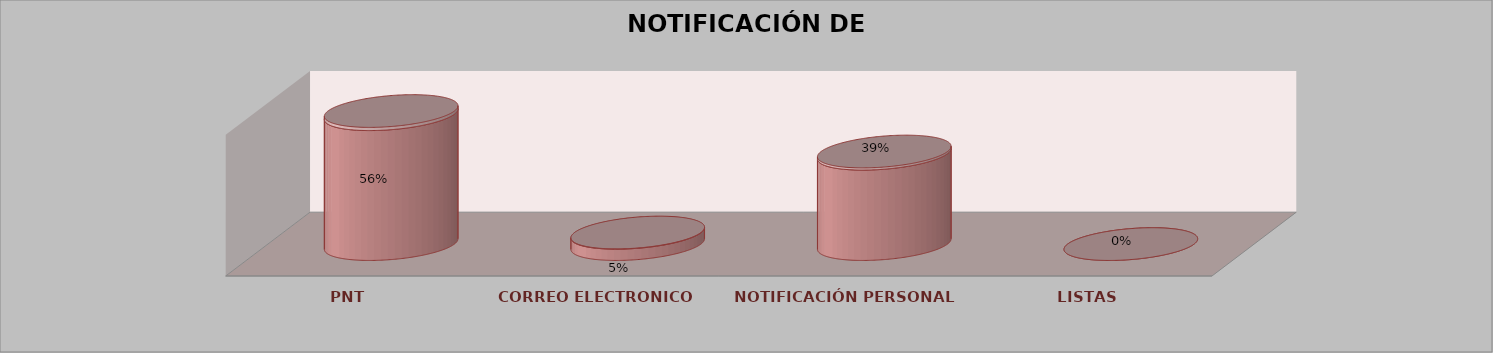
| Category | Series 0 | Series 1 | Series 2 | Series 3 | Series 4 |
|---|---|---|---|---|---|
| PNT |  |  |  | 23 | 0.561 |
| CORREO ELECTRONICO |  |  |  | 2 | 0.049 |
| NOTIFICACIÓN PERSONAL |  |  |  | 16 | 0.39 |
| LISTAS |  |  |  | 0 | 0 |